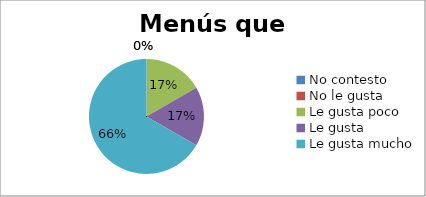
| Category | Series 0 |
|---|---|
| No contesto | 0 |
| No le gusta | 0 |
| Le gusta poco | 1 |
| Le gusta | 1 |
| Le gusta mucho | 4 |